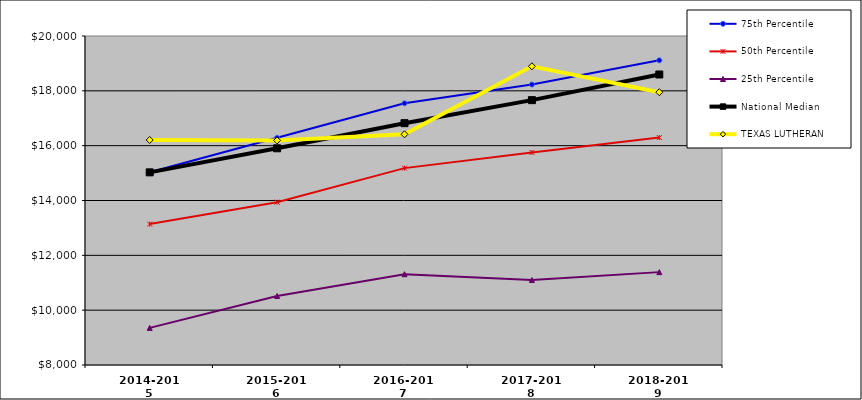
| Category | 75th Percentile | 50th Percentile | 25th Percentile | National Median | TEXAS LUTHERAN |
|---|---|---|---|---|---|
| 2014-2015 | 15032.75 | 13140 | 9353.25 | 15026.5 | 16208 |
| 2015-2016 | 16287 | 13939.5 | 10517.75 | 15904.5 | 16193 |
| 2016-2017 | 17545 | 15181 | 11311.25 | 16820.5 | 16415 |
| 2017-2018 | 18230.5 | 15753.5 | 11100.5 | 17661 | 18895 |
| 2018-2019 | 19112.75 | 16296 | 11387.5 | 18596 | 17949 |